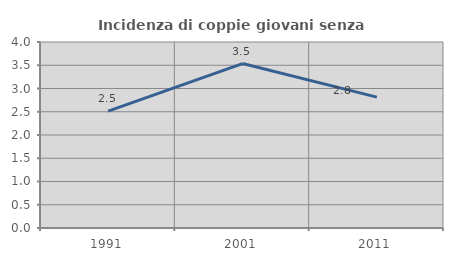
| Category | Incidenza di coppie giovani senza figli |
|---|---|
| 1991.0 | 2.513 |
| 2001.0 | 3.536 |
| 2011.0 | 2.814 |